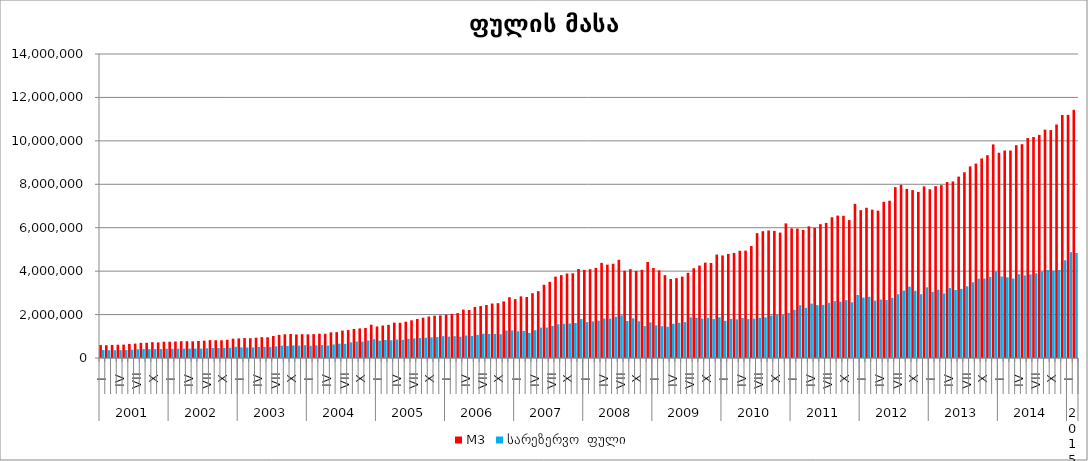
| Category | M3 | სარეზერვო  ფული |
|---|---|---|
| 0 | 597892.838 | 368113.789 |
| 1 | 590426.286 | 360695.733 |
| 2 | 602899.421 | 357324.628 |
| 3 | 611180.553 | 361166.686 |
| 4 | 616358.105 | 362346.18 |
| 5 | 645210.421 | 381083.24 |
| 6 | 663599.942 | 402483.855 |
| 7 | 696605.363 | 411588.579 |
| 8 | 702688.607 | 404261.809 |
| 9 | 727827.111 | 410673.987 |
| 10 | 718454.671 | 416153.614 |
| 11 | 749330.825 | 431422.235 |
| 12 | 750185.616 | 429726.073 |
| 13 | 757671.59 | 431588.789 |
| 14 | 774232.628 | 432833.5 |
| 15 | 773727.497 | 433367.687 |
| 16 | 767427.667 | 435756.942 |
| 17 | 784325.151 | 436131.989 |
| 18 | 798160.683 | 447175.699 |
| 19 | 823446.096 | 458427.931 |
| 20 | 817852.692 | 459168.493 |
| 21 | 816643.104 | 468858.867 |
| 22 | 841254.47 | 472631.74 |
| 23 | 890308.246 | 516336.93 |
| 24 | 901532.573 | 491975.846 |
| 25 | 916839.133 | 484756.557 |
| 26 | 910331.132 | 488457.22 |
| 27 | 933779.325 | 506321.244 |
| 28 | 957873.449 | 514779.593 |
| 29 | 955824.015 | 509292.096 |
| 30 | 1012644.794 | 538803.005 |
| 31 | 1063375.152 | 570944.945 |
| 32 | 1090754.579 | 556424.045 |
| 33 | 1104889.057 | 578514.737 |
| 34 | 1086193.114 | 573044.246 |
| 35 | 1095627.685 | 589940.686 |
| 36 | 1091371.101 | 562829.406 |
| 37 | 1097498.052 | 579702.363 |
| 38 | 1122273.591 | 596099.397 |
| 39 | 1116083.199 | 576894.253 |
| 40 | 1182735.206 | 625626.766 |
| 41 | 1191447.7 | 658852.179 |
| 42 | 1263946.376 | 652673.421 |
| 43 | 1287237.72 | 720760.921 |
| 44 | 1339131.823 | 759842.635 |
| 45 | 1363278.363 | 758286.872 |
| 46 | 1383920.153 | 809305.597 |
| 47 | 1534207.885 | 866658.713 |
| 48 | 1451334.049 | 798808.552 |
| 49 | 1495748.596 | 827722.724 |
| 50 | 1526497.698 | 818071.357 |
| 51 | 1628796.904 | 849320.173 |
| 52 | 1621736.681 | 838727.375 |
| 53 | 1671231.956 | 885798.463 |
| 54 | 1736830.579 | 905179.439 |
| 55 | 1799467.759 | 926119.1 |
| 56 | 1857198.808 | 936048.764 |
| 57 | 1912226.844 | 953866.276 |
| 58 | 1946562.589 | 962453.822 |
| 59 | 1961504.651 | 1007368.047 |
| 60 | 1993635.252 | 985529.837 |
| 61 | 2034234.826 | 1006861.291 |
| 62 | 2068041.342 | 981188.537 |
| 63 | 2231719.944 | 1037670.32 |
| 64 | 2211726.006 | 1017229.525 |
| 65 | 2350643.488 | 1063055.584 |
| 66 | 2391487.856 | 1117976.357 |
| 67 | 2443084.258 | 1106750.341 |
| 68 | 2508732.57 | 1112012.223 |
| 69 | 2525728.196 | 1095465.011 |
| 70 | 2606222.861 | 1267573.815 |
| 71 | 2799779.664 | 1272098.537 |
| 72 | 2712080.574 | 1232053.134 |
| 73 | 2839247.957 | 1248398.16 |
| 74 | 2809129.727 | 1153980.424 |
| 75 | 2983302.624 | 1277207.234 |
| 76 | 3078896.375 | 1403307.841 |
| 77 | 3374827.695 | 1404077.538 |
| 78 | 3507235.628 | 1479672.329 |
| 79 | 3747060.191 | 1555771.96 |
| 80 | 3818751.76 | 1574900.45 |
| 81 | 3892352.971 | 1588923.076 |
| 82 | 3901496.079 | 1610500.365 |
| 83 | 4098857.212 | 1793802.01 |
| 84 | 4058253.618 | 1652937.267 |
| 85 | 4091244.212 | 1686843.876 |
| 86 | 4150553.585 | 1722001.473 |
| 87 | 4381379.554 | 1820171.278 |
| 88 | 4298190.088 | 1815126.575 |
| 89 | 4341414.027 | 1897531.247 |
| 90 | 4525406.244 | 1960868.235 |
| 91 | 4014687.917 | 1706188.166 |
| 92 | 4089682.299 | 1828526.98 |
| 93 | 4009512.363 | 1691326.122 |
| 94 | 4062943.074 | 1470551.675 |
| 95 | 4421698.466 | 1642080.787 |
| 96 | 4146756.21 | 1505078.055 |
| 97 | 4035788.433 | 1464069.396 |
| 98 | 3815625.073 | 1441942.103 |
| 99 | 3637932.132 | 1578292.367 |
| 100 | 3676519.248 | 1622579.421 |
| 101 | 3746883.705 | 1654014.811 |
| 102 | 3922696.007 | 1872828.703 |
| 103 | 4133600.643 | 1856192.394 |
| 104 | 4258468.82 | 1815233.312 |
| 105 | 4392845.734 | 1850711.225 |
| 106 | 4374192.684 | 1794464.923 |
| 107 | 4763606.912 | 1874961.354 |
| 108 | 4721982.505 | 1713536.285 |
| 109 | 4792163.56 | 1796688.9 |
| 110 | 4837431.557 | 1779992.609 |
| 111 | 4938622.79 | 1840471.316 |
| 112 | 4945487.009 | 1794174.909 |
| 113 | 5154387.443 | 1814725.803 |
| 114 | 5750227.904 | 1850494.326 |
| 115 | 5840047.26 | 1871816.662 |
| 116 | 5874149.127 | 1954729.072 |
| 117 | 5852007.985 | 1997836.737 |
| 118 | 5775636.555 | 1975036.135 |
| 119 | 6199008.806 | 2081128.752 |
| 120 | 5970729.983 | 2226103.832 |
| 121 | 5959087.97 | 2430168.133 |
| 122 | 5899005.704 | 2311380.782 |
| 123 | 6062639.273 | 2505955.775 |
| 124 | 5995136.02 | 2432249.082 |
| 125 | 6164201.229 | 2448706.203 |
| 126 | 6221284.913 | 2542648.036 |
| 127 | 6481689.318 | 2621687.544 |
| 128 | 6558253.631 | 2595533.261 |
| 129 | 6550014.362 | 2664580.778 |
| 130 | 6352920.652 | 2566552.114 |
| 131 | 7097777.273 | 2901038.828 |
| 132 | 6808396.175 | 2780440.849 |
| 133 | 6918705.592 | 2819931.093 |
| 134 | 6831744.234 | 2642386.812 |
| 135 | 6785908.965 | 2691389.762 |
| 136 | 7194518.793 | 2671575.273 |
| 137 | 7242926.553 | 2775361.632 |
| 138 | 7867540.374 | 2937987.976 |
| 139 | 7971705.487 | 3107541.586 |
| 140 | 7789118.852 | 3285540.123 |
| 141 | 7732668.513 | 3094823.14 |
| 142 | 7648449.547 | 2937213.459 |
| 143 | 7903738.971 | 3255313.659 |
| 144 | 7771222.7 | 3047796.187 |
| 145 | 7912345.956 | 3146225.813 |
| 146 | 7959105.687 | 2972028.987 |
| 147 | 8103469.276 | 3220089.371 |
| 148 | 8130730.824 | 3129434.801 |
| 149 | 8354699.149 | 3184262.276 |
| 150 | 8553410.296 | 3302037.366 |
| 151 | 8826582.176 | 3487678.696 |
| 152 | 8953801.477 | 3655478.769 |
| 153 | 9188613.332 | 3663277.537 |
| 154 | 9339568.079 | 3737236.26 |
| 155 | 9836618.601 | 3989083.317 |
| 156 | 9453972.937 | 3756141.816 |
| 157 | 9556546.423 | 3717320.784 |
| 158 | 9555304.952 | 3659706.219 |
| 159 | 9799048.091 | 3855909.639 |
| 160 | 9846212.502 | 3804159.071 |
| 161 | 10130909.316 | 3846993.656 |
| 162 | 10178205.898 | 3901000.343 |
| 163 | 10273632.539 | 3988861.155 |
| 164 | 10516743.129 | 4056513.111 |
| 165 | 10497444.423 | 4020878.96 |
| 166 | 10754604.791 | 4050811.645 |
| 167 | 11189835.906 | 4501009.92 |
| 168 | 11197675.774 | 4875122.328 |
| 169 | 11430746.277 | 4837812.334 |